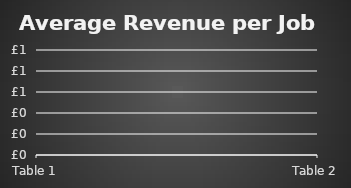
| Category | Series 0 |
|---|---|
| Table 1 | 0 |
| Table 2 | 0 |